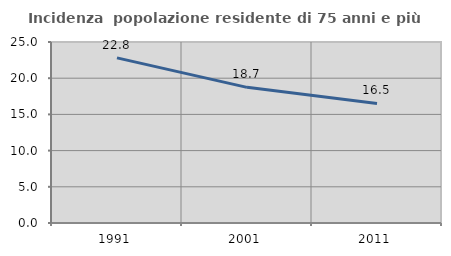
| Category | Incidenza  popolazione residente di 75 anni e più |
|---|---|
| 1991.0 | 22.807 |
| 2001.0 | 18.735 |
| 2011.0 | 16.518 |